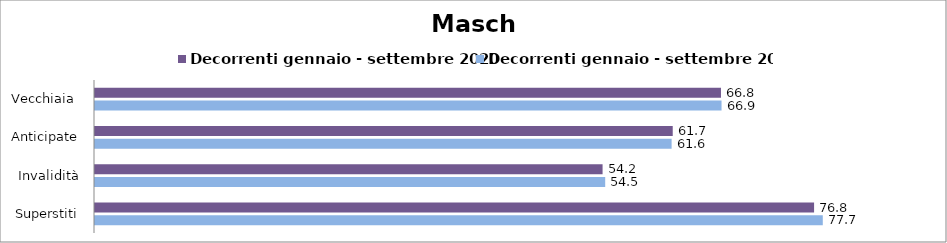
| Category | Decorrenti gennaio - settembre 2020 | Decorrenti gennaio - settembre 2021 |
|---|---|---|
| Vecchiaia  | 66.83 | 66.89 |
| Anticipate | 61.68 | 61.56 |
| Invalidità | 54.19 | 54.47 |
| Superstiti | 76.77 | 77.7 |